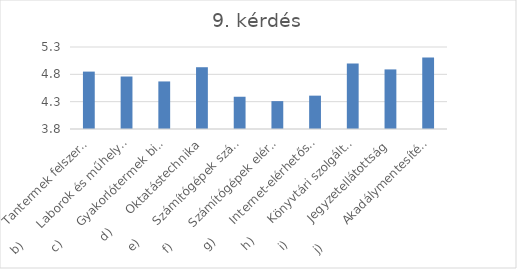
| Category | Series 0 |
|---|---|
| a)      Tantermek felszereltsége | 4.85 |
| b)      Laborok és műhelyek, műtermek felszereltsége | 4.76 |
| c)      Gyakorlótermek biztosítása | 4.67 |
| d)      Oktatástechnika | 4.93 |
| e)      Számítógépek száma | 4.39 |
| f)       Számítógépek elérhetősége | 4.31 |
| g)      Internet-elérhetőség | 4.41 |
| h)      Könyvtári szolgáltatások | 5 |
| i)        Jegyzetellátottság | 4.89 |
| j)        Akadálymentesítés minősége | 5.11 |